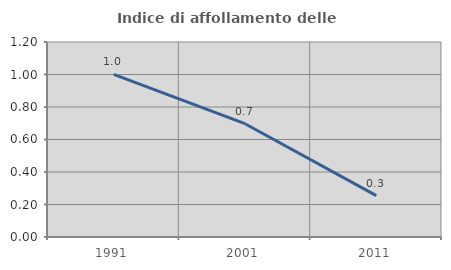
| Category | Indice di affollamento delle abitazioni  |
|---|---|
| 1991.0 | 1.001 |
| 2001.0 | 0.697 |
| 2011.0 | 0.255 |